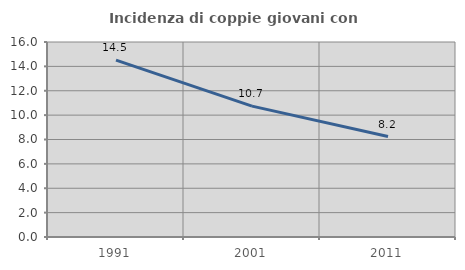
| Category | Incidenza di coppie giovani con figli |
|---|---|
| 1991.0 | 14.516 |
| 2001.0 | 10.737 |
| 2011.0 | 8.245 |